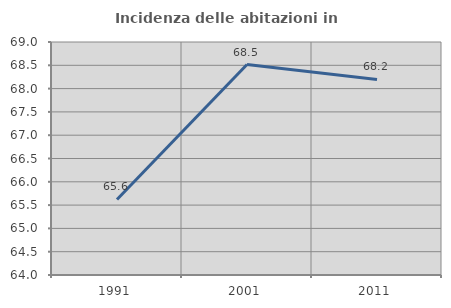
| Category | Incidenza delle abitazioni in proprietà  |
|---|---|
| 1991.0 | 65.622 |
| 2001.0 | 68.517 |
| 2011.0 | 68.195 |